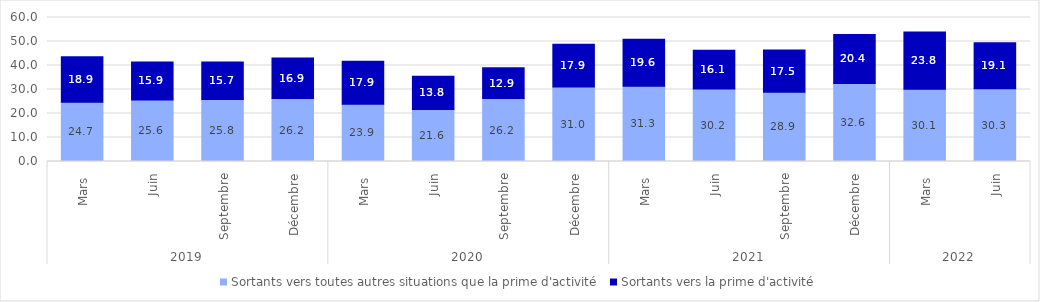
| Category | Sortants vers toutes autres situations que la prime d'activité  | Sortants vers la prime d'activité |
|---|---|---|
| 0 | 24.7 | 18.9 |
| 1 | 25.6 | 15.9 |
| 2 | 25.79 | 15.709 |
| 3 | 26.203 | 16.932 |
| 4 | 23.905 | 17.917 |
| 5 | 21.643 | 13.842 |
| 6 | 26.222 | 12.872 |
| 7 | 31.007 | 17.859 |
| 8 | 31.335 | 19.633 |
| 9 | 30.248 | 16.065 |
| 10 | 28.888 | 17.525 |
| 11 | 32.55 | 20.372 |
| 12 | 30.105 | 23.826 |
| 13 | 30.342 | 19.137 |